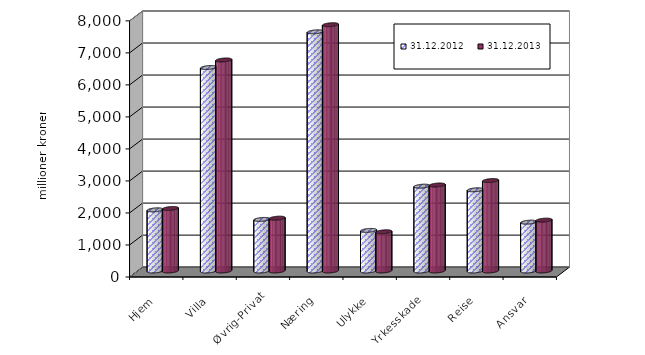
| Category | 31.12.2012 | 31.12.2013 |
|---|---|---|
| Hjem | 1911.197 | 1952.77 |
| Villa | 6355.658 | 6591.074 |
| Øvrig-Privat | 1611.841 | 1650.752 |
| Næring | 7469.993 | 7692.706 |
| Ulykke | 1268.219 | 1225.105 |
| Yrkesskade | 2649.814 | 2686.194 |
| Reise | 2536.646 | 2825.281 |
| Ansvar | 1525.946 | 1589.018 |